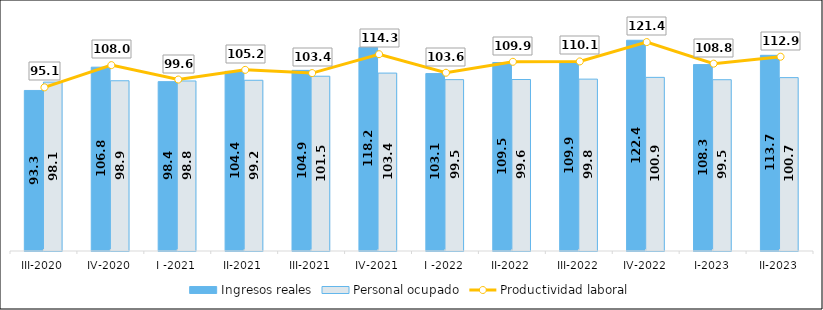
| Category | Ingresos reales | Personal ocupado |
|---|---|---|
| III-2020 | 93.256 | 98.105 |
| IV-2020 | 106.788 | 98.9 |
| I -2021 | 98.387 | 98.769 |
| II-2021 | 104.362 | 99.179 |
| III-2021 | 104.934 | 101.532 |
| IV-2021 | 118.168 | 103.354 |
| I -2022 | 103.081 | 99.546 |
| II-2022 | 109.494 | 99.623 |
| III-2022 | 109.949 | 99.843 |
| IV-2022 | 122.423 | 100.867 |
| I-2023 | 108.3 | 99.5 |
| II-2023 | 113.674 | 100.721 |